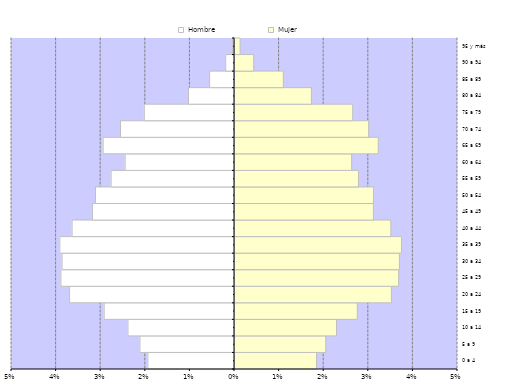
| Category | Hombre | Mujer |
|---|---|---|
| 0 a 4 | -0.019 | 0.018 |
| 5 a 9 | -0.021 | 0.02 |
| 10 a 14 | -0.024 | 0.023 |
| 15 a 19 | -0.029 | 0.027 |
| 20 a 24 | -0.037 | 0.035 |
| 25 a 29 | -0.039 | 0.037 |
| 30 a 34 | -0.039 | 0.037 |
| 35 a 39 | -0.039 | 0.037 |
| 40 a 44 | -0.036 | 0.035 |
| 45 a 49 | -0.032 | 0.031 |
| 50 a 54 | -0.031 | 0.031 |
| 55 a 59 | -0.028 | 0.028 |
| 60 a 64 | -0.025 | 0.026 |
| 65 a 69 | -0.029 | 0.032 |
| 70 a 74 | -0.026 | 0.03 |
| 75 a 79 | -0.02 | 0.026 |
| 80 a 84 | -0.01 | 0.017 |
| 85 a 89 | -0.006 | 0.011 |
| 90 a 94 | -0.002 | 0.004 |
| 95 y más | 0 | 0.001 |